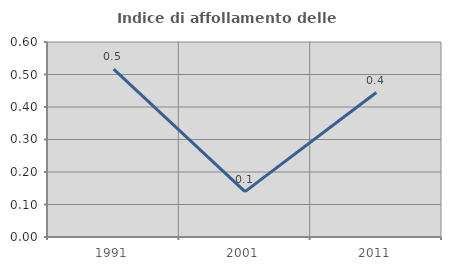
| Category | Indice di affollamento delle abitazioni  |
|---|---|
| 1991.0 | 0.517 |
| 2001.0 | 0.14 |
| 2011.0 | 0.444 |